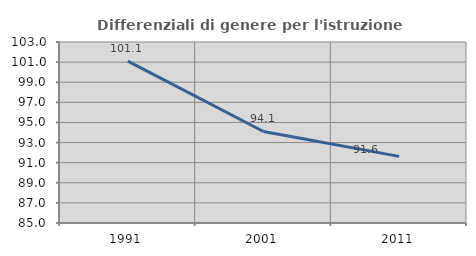
| Category | Differenziali di genere per l'istruzione superiore |
|---|---|
| 1991.0 | 101.09 |
| 2001.0 | 94.103 |
| 2011.0 | 91.625 |